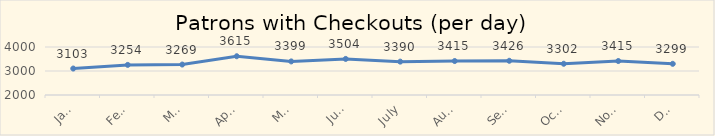
| Category | Series 0 |
|---|---|
| January | 3103.129 |
| February | 3254.207 |
| March | 3269.065 |
| April | 3614.933 |
| May | 3399.226 |
| June | 3503.633 |
| July | 3390.484 |
| August | 3415.129 |
| September | 3425.733 |
| October | 3301.516 |
| November | 3415.133 |
| December | 3299.226 |